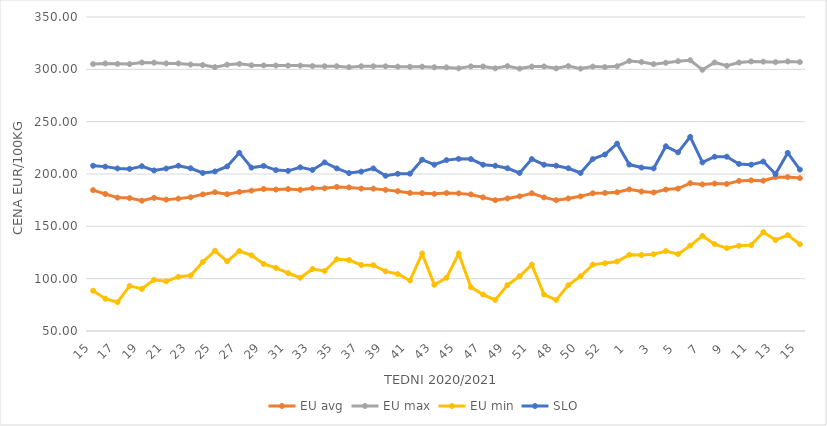
| Category | EU avg | EU max | EU min | SLO |
|---|---|---|---|---|
| 15.0 | 184.591 | 305.08 | 88.508 | 207.87 |
| 16.0 | 180.892 | 305.63 | 80.873 | 207.05 |
| 17.0 | 177.437 | 305.27 | 77.506 | 205.29 |
| 18.0 | 176.995 | 305.01 | 93.104 | 204.82 |
| 19.0 | 174.49 | 306.49 | 90.169 | 207.44 |
| 20.0 | 177.204 | 306.38 | 98.928 | 203.41 |
| 21.0 | 175.519 | 305.66 | 97.454 | 205.19 |
| 22.0 | 176.473 | 305.64 | 101.792 | 207.91 |
| 23.0 | 177.741 | 304.59 | 102.918 | 205.46 |
| 24.0 | 180.501 | 304.1 | 115.936 | 201 |
| 25.0 | 182.568 | 302.13 | 126.655 | 202.43 |
| 26.0 | 180.667 | 304.43 | 116.597 | 207.19 |
| 27.0 | 182.833 | 305.22 | 126.397 | 220.25 |
| 28.0 | 184.121 | 303.88 | 122.317 | 206.06 |
| 29.0 | 185.712 | 303.73 | 114.082 | 207.73 |
| 30.0 | 185.141 | 303.63 | 110.314 | 203.73 |
| 31.0 | 185.621 | 303.57 | 105.336 | 203 |
| 32.0 | 184.887 | 303.58 | 100.908 | 206.36 |
| 33.0 | 186.411 | 303.17 | 109.191 | 203.88 |
| 34.0 | 186.338 | 302.96 | 107.355 | 211.07 |
| 35.0 | 187.628 | 302.99 | 118.534 | 205.34 |
| 36.0 | 187.19 | 302.05 | 117.814 | 200.88 |
| 37.0 | 186.038 | 302.98 | 113.058 | 202.29 |
| 38.0 | 185.986 | 302.94 | 112.896 | 205.33 |
| 39.0 | 184.836 | 302.88 | 106.953 | 198.33 |
| 40.0 | 183.595 | 302.56 | 104.426 | 200.21 |
| 41.0 | 181.893 | 302.44 | 98.23 | 200.3 |
| 42.0 | 181.671 | 302.52 | 123.908 | 213.66 |
| 43.0 | 181.023 | 302.01 | 94.177 | 208.86 |
| 44.0 | 181.795 | 301.86 | 100.908 | 213.25 |
| 45.0 | 181.489 | 300.98 | 124 | 214.51 |
| 46.0 | 180.473 | 302.82 | 91.889 | 214.27 |
| 47.0 | 177.656 | 302.7 | 84.832 | 208.87 |
| 48.0 | 174.977 | 300.94 | 79.697 | 207.9 |
| 49.0 | 176.65 | 303.09 | 93.873 | 205.48 |
| 50.0 | 178.648 | 300.7 | 102.316 | 200.99 |
| 51.0 | 181.58 | 302.62 | 113.46 | 214.25 |
| 47.0 | 177.656 | 302.7 | 84.832 | 208.87 |
| 48.0 | 174.977 | 300.94 | 79.697 | 207.9 |
| 49.0 | 176.65 | 303.09 | 93.873 | 205.48 |
| 50.0 | 178.648 | 300.7 | 102.316 | 200.99 |
| 51.0 | 181.58 | 302.62 | 113.46 | 214.25 |
| 52.0 | 181.9 | 302.14 | 114.76 | 218.61 |
| 53.0 | 182.536 | 303 | 116.375 | 229 |
| 1.0 | 185.3 | 308 | 122.769 | 209 |
| 2.0 | 183.25 | 307.1 | 122.609 | 206.15 |
| 3.0 | 182.393 | 304.91 | 123.32 | 205.35 |
| 4.0 | 185.158 | 306.22 | 126.329 | 226.48 |
| 5.0 | 186.04 | 307.79 | 123.461 | 220.65 |
| 6.0 | 191.206 | 308.7 | 131.528 | 235.46 |
| 7.0 | 190.028 | 299.55 | 140.902 | 211.1 |
| 8.0 | 190.875 | 306.55 | 132.97 | 216.51 |
| 9.0 | 190.519 | 303.4 | 129.173 | 216.54 |
| 10.0 | 193.416 | 306.48 | 131.374 | 209.61 |
| 11.0 | 193.936 | 307.58 | 132.024 | 208.91 |
| 12.0 | 193.599 | 307.33 | 144.506 | 211.87 |
| 13.0 | 196.932 | 306.85 | 136.936 | 199.93 |
| 14.0 | 197.044 | 307.56 | 141.574 | 220.15 |
| 15.0 | 196.085 | 306.96 | 132.893 | 204.2 |